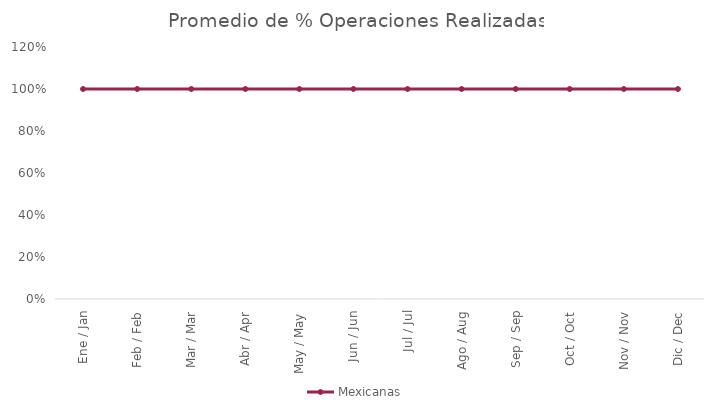
| Category | Mexicanas |
|---|---|
| Ene / Jan | 1 |
| Feb / Feb | 1 |
| Mar / Mar | 1 |
| Abr / Apr | 1 |
| May / May | 1 |
| Jun / Jun | 1 |
| Jul / Jul | 1 |
| Ago / Aug | 1 |
| Sep / Sep | 1 |
| Oct / Oct | 1 |
| Nov / Nov | 1 |
| Dic / Dec | 1 |